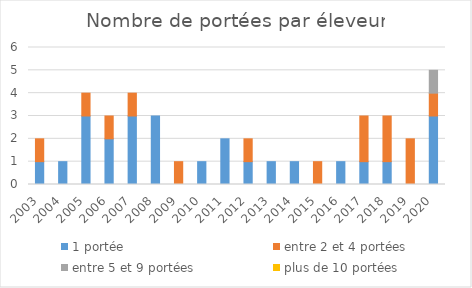
| Category | 1 portée | entre 2 et 4 portées | entre 5 et 9 portées | plus de 10 portées |
|---|---|---|---|---|
| 2003.0 | 1 | 1 | 0 | 0 |
| 2004.0 | 1 | 0 | 0 | 0 |
| 2005.0 | 3 | 1 | 0 | 0 |
| 2006.0 | 2 | 1 | 0 | 0 |
| 2007.0 | 3 | 1 | 0 | 0 |
| 2008.0 | 3 | 0 | 0 | 0 |
| 2009.0 | 0 | 1 | 0 | 0 |
| 2010.0 | 1 | 0 | 0 | 0 |
| 2011.0 | 2 | 0 | 0 | 0 |
| 2012.0 | 1 | 1 | 0 | 0 |
| 2013.0 | 1 | 0 | 0 | 0 |
| 2014.0 | 1 | 0 | 0 | 0 |
| 2015.0 | 0 | 1 | 0 | 0 |
| 2016.0 | 1 | 0 | 0 | 0 |
| 2017.0 | 1 | 2 | 0 | 0 |
| 2018.0 | 1 | 2 | 0 | 0 |
| 2019.0 | 0 | 2 | 0 | 0 |
| 2020.0 | 3 | 1 | 1 | 0 |